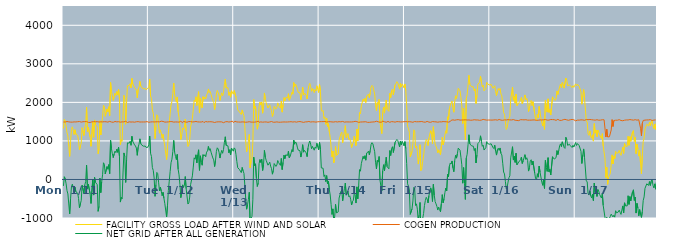
| Category | FACILITY GROSS LOAD AFTER WIND AND SOLAR | COGEN PRODUCTION | NET GRID AFTER ALL GENERATION |
|---|---|---|---|
|  Mon  1/11 | 1323 | 1490 | -167 |
|  Mon  1/11 | 1555 | 1485 | 70 |
|  Mon  1/11 | 1502 | 1491 | 11 |
|  Mon  1/11 | 1378 | 1491 | -113 |
|  Mon  1/11 | 1214 | 1503 | -289 |
|  Mon  1/11 | 1129 | 1505 | -376 |
|  Mon  1/11 | 858 | 1494 | -636 |
|  Mon  1/11 | 599 | 1493 | -894 |
|  Mon  1/11 | 986 | 1488 | -502 |
|  Mon  1/11 | 1296 | 1488 | -192 |
|  Mon  1/11 | 1365 | 1487 | -122 |
|  Mon  1/11 | 1280 | 1495 | -215 |
|  Mon  1/11 | 1166 | 1493 | -327 |
|  Mon  1/11 | 1289 | 1493 | -204 |
|  Mon  1/11 | 1171 | 1492 | -321 |
|  Mon  1/11 | 1183 | 1498 | -315 |
|  Mon  1/11 | 1144 | 1498 | -354 |
|  Mon  1/11 | 992 | 1485 | -493 |
|  Mon  1/11 | 767 | 1503 | -736 |
|  Mon  1/11 | 863 | 1501 | -638 |
|  Mon  1/11 | 942 | 1488 | -546 |
|  Mon  1/11 | 1341 | 1489 | -148 |
|  Mon  1/11 | 1361 | 1498 | -137 |
|  Mon  1/11 | 1142 | 1501 | -359 |
|  Mon  1/11 | 1358 | 1500 | -142 |
|  Mon  1/11 | 1432 | 1486 | -54 |
|  Mon  1/11 | 1874 | 1502 | 372 |
|  Mon  1/11 | 1244 | 1494 | -250 |
|  Mon  1/11 | 1355 | 1481 | -126 |
|  Mon  1/11 | 1366 | 1489 | -123 |
|  Mon  1/11 | 1105 | 1478 | -373 |
|  Mon  1/11 | 860 | 1483 | -623 |
|  Mon  1/11 | 860 | 1495 | -635 |
|  Mon  1/11 | 1492 | 1484 | 8 |
|  Mon  1/11 | 1095 | 1500 | -405 |
|  Mon  1/11 | 1544 | 1491 | 53 |
|  Mon  1/11 | 1423 | 1496 | -73 |
|  Mon  1/11 | 1428 | 1489 | -61 |
|  Mon  1/11 | 1363 | 1499 | -136 |
|  Mon  1/11 | 666 | 1493 | -827 |
|  Mon  1/11 | 793 | 1490 | -697 |
|  Mon  1/11 | 1524 | 1488 | 36 |
|  Mon  1/11 | 1153 | 1495 | -342 |
|  Mon  1/11 | 1439 | 1498 | -59 |
|  Mon  1/11 | 1615 | 1494 | 121 |
|  Mon  1/11 | 1924 | 1491 | 433 |
|  Mon  1/11 | 1892 | 1498 | 394 |
|  Mon  1/11 | 1637 | 1493 | 144 |
|  Mon  1/11 | 1657 | 1496 | 161 |
|  Mon  1/11 | 1830 | 1495 | 335 |
|  Mon  1/11 | 1753 | 1488 | 265 |
|  Mon  1/11 | 1887 | 1502 | 385 |
|  Mon  1/11 | 1657 | 1506 | 151 |
|  Mon  1/11 | 2514 | 1500 | 1014 |
|  Mon  1/11 | 2287 | 1490 | 797 |
|  Mon  1/11 | 2169 | 1502 | 667 |
|  Mon  1/11 | 2050 | 1483 | 567 |
|  Mon  1/11 | 2150 | 1488 | 662 |
|  Mon  1/11 | 2239 | 1504 | 735 |
|  Mon  1/11 | 2179 | 1484 | 695 |
|  Mon  1/11 | 2280 | 1494 | 786 |
|  Mon  1/11 | 2200 | 1496 | 704 |
|  Mon  1/11 | 2333 | 1498 | 835 |
|  Mon  1/11 | 2101 | 1495 | 606 |
|  Mon  1/11 | 900 | 1487 | -587 |
|  Mon  1/11 | 1032 | 1495 | -463 |
|  Mon  1/11 | 990 | 1494 | -504 |
|  Mon  1/11 | 1658 | 1490 | 168 |
|  Mon  1/11 | 2182 | 1494 | 688 |
|  Mon  1/11 | 2088 | 1493 | 595 |
|  Mon  1/11 | 1432 | 1509 | -77 |
|  Mon  1/11 | 2020 | 1502 | 518 |
|  Mon  1/11 | 2428 | 1478 | 950 |
|  Mon  1/11 | 2452 | 1502 | 950 |
|  Mon  1/11 | 2437 | 1495 | 942 |
|  Mon  1/11 | 2484 | 1492 | 992 |
|  Mon  1/11 | 2375 | 1489 | 886 |
|  Mon  1/11 | 2621 | 1502 | 1119 |
|  Mon  1/11 | 2476 | 1492 | 984 |
|  Mon  1/11 | 2458 | 1492 | 966 |
|  Mon  1/11 | 2382 | 1486 | 896 |
|  Mon  1/11 | 2355 | 1486 | 869 |
|  Mon  1/11 | 2311 | 1497 | 814 |
|  Mon  1/11 | 2117 | 1491 | 626 |
|  Mon  1/11 | 2337 | 1500 | 837 |
|  Mon  1/11 | 2398 | 1482 | 916 |
|  Mon  1/11 | 2544 | 1490 | 1054 |
|  Mon  1/11 | 2425 | 1496 | 929 |
|  Mon  1/11 | 2383 | 1491 | 892 |
|  Mon  1/11 | 2363 | 1491 | 872 |
|  Mon  1/11 | 2354 | 1491 | 863 |
|  Mon  1/11 | 2358 | 1495 | 863 |
|  Mon  1/11 | 2358 | 1492 | 866 |
|  Mon  1/11 | 2323 | 1493 | 830 |
|  Mon  1/11 | 2356 | 1501 | 855 |
|  Mon  1/11 | 2338 | 1501 | 837 |
|  Tue  1/12 | 2383 | 1483 | 900 |
|  Tue  1/12 | 2604 | 1480 | 1124 |
|  Tue  1/12 | 2167 | 1491 | 676 |
|  Tue  1/12 | 2094 | 1499 | 595 |
|  Tue  1/12 | 1804 | 1495 | 309 |
|  Tue  1/12 | 1720 | 1485 | 235 |
|  Tue  1/12 | 1528 | 1492 | 36 |
|  Tue  1/12 | 1059 | 1496 | -437 |
|  Tue  1/12 | 1361 | 1495 | -134 |
|  Tue  1/12 | 1678 | 1495 | 183 |
|  Tue  1/12 | 1649 | 1497 | 152 |
|  Tue  1/12 | 1418 | 1488 | -70 |
|  Tue  1/12 | 1200 | 1494 | -294 |
|  Tue  1/12 | 1287 | 1488 | -201 |
|  Tue  1/12 | 1207 | 1512 | -305 |
|  Tue  1/12 | 1070 | 1491 | -421 |
|  Tue  1/12 | 1170 | 1505 | -335 |
|  Tue  1/12 | 1003 | 1493 | -490 |
|  Tue  1/12 | 860 | 1488 | -628 |
|  Tue  1/12 | 874 | 1503 | -629 |
|  Tue  1/12 | 516 | 1490 | -974 |
|  Tue  1/12 | 811 | 1497 | -686 |
|  Tue  1/12 | 1210 | 1493 | -283 |
|  Tue  1/12 | 1468 | 1511 | -43 |
|  Tue  1/12 | 1708 | 1501 | 207 |
|  Tue  1/12 | 1932 | 1498 | 434 |
|  Tue  1/12 | 2025 | 1500 | 525 |
|  Tue  1/12 | 2222 | 1498 | 724 |
|  Tue  1/12 | 2500 | 1488 | 1012 |
|  Tue  1/12 | 2206 | 1494 | 712 |
|  Tue  1/12 | 2090 | 1492 | 598 |
|  Tue  1/12 | 2004 | 1489 | 515 |
|  Tue  1/12 | 2140 | 1491 | 649 |
|  Tue  1/12 | 1756 | 1494 | 262 |
|  Tue  1/12 | 1606 | 1487 | 119 |
|  Tue  1/12 | 1376 | 1509 | -133 |
|  Tue  1/12 | 1036 | 1509 | -473 |
|  Tue  1/12 | 1148 | 1486 | -338 |
|  Tue  1/12 | 1332 | 1472 | -140 |
|  Tue  1/12 | 1302 | 1509 | -207 |
|  Tue  1/12 | 1358 | 1504 | -146 |
|  Tue  1/12 | 1566 | 1491 | 75 |
|  Tue  1/12 | 1244 | 1483 | -239 |
|  Tue  1/12 | 1249 | 1485 | -236 |
|  Tue  1/12 | 854 | 1492 | -638 |
|  Tue  1/12 | 893 | 1502 | -609 |
|  Tue  1/12 | 1044 | 1500 | -456 |
|  Tue  1/12 | 1365 | 1500 | -135 |
|  Tue  1/12 | 1376 | 1508 | -132 |
|  Tue  1/12 | 1585 | 1492 | 93 |
|  Tue  1/12 | 1810 | 1489 | 321 |
|  Tue  1/12 | 2057 | 1496 | 561 |
|  Tue  1/12 | 2016 | 1491 | 525 |
|  Tue  1/12 | 2144 | 1504 | 640 |
|  Tue  1/12 | 1920 | 1491 | 429 |
|  Tue  1/12 | 2133 | 1493 | 640 |
|  Tue  1/12 | 2278 | 1508 | 770 |
|  Tue  1/12 | 1727 | 1491 | 236 |
|  Tue  1/12 | 2113 | 1500 | 613 |
|  Tue  1/12 | 1937 | 1490 | 447 |
|  Tue  1/12 | 1853 | 1484 | 369 |
|  Tue  1/12 | 2147 | 1503 | 644 |
|  Tue  1/12 | 2084 | 1476 | 608 |
|  Tue  1/12 | 2138 | 1496 | 642 |
|  Tue  1/12 | 2091 | 1502 | 589 |
|  Tue  1/12 | 2199 | 1491 | 708 |
|  Tue  1/12 | 2234 | 1493 | 741 |
|  Tue  1/12 | 2348 | 1491 | 857 |
|  Tue  1/12 | 2254 | 1497 | 757 |
|  Tue  1/12 | 2281 | 1482 | 799 |
|  Tue  1/12 | 2204 | 1497 | 707 |
|  Tue  1/12 | 2119 | 1487 | 632 |
|  Tue  1/12 | 2049 | 1491 | 558 |
|  Tue  1/12 | 1995 | 1486 | 509 |
|  Tue  1/12 | 1813 | 1478 | 335 |
|  Tue  1/12 | 1987 | 1490 | 497 |
|  Tue  1/12 | 2219 | 1491 | 728 |
|  Tue  1/12 | 2310 | 1489 | 821 |
|  Tue  1/12 | 2285 | 1495 | 790 |
|  Tue  1/12 | 2187 | 1483 | 704 |
|  Tue  1/12 | 2050 | 1495 | 555 |
|  Tue  1/12 | 2174 | 1500 | 674 |
|  Tue  1/12 | 2248 | 1493 | 755 |
|  Tue  1/12 | 2172 | 1493 | 679 |
|  Tue  1/12 | 2247 | 1473 | 774 |
|  Tue  1/12 | 2464 | 1498 | 966 |
|  Tue  1/12 | 2602 | 1495 | 1107 |
|  Tue  1/12 | 2373 | 1490 | 883 |
|  Tue  1/12 | 2388 | 1500 | 888 |
|  Tue  1/12 | 2379 | 1508 | 871 |
|  Tue  1/12 | 2182 | 1490 | 692 |
|  Tue  1/12 | 2263 | 1492 | 771 |
|  Tue  1/12 | 2135 | 1497 | 638 |
|  Tue  1/12 | 2304 | 1489 | 815 |
|  Tue  1/12 | 2304 | 1513 | 791 |
|  Tue  1/12 | 2211 | 1478 | 733 |
|  Wed  1/13 | 2305 | 1485 | 820 |
|  Wed  1/13 | 2299 | 1507 | 792 |
|  Wed  1/13 | 2136 | 1484 | 652 |
|  Wed  1/13 | 1958 | 1492 | 466 |
|  Wed  1/13 | 1805 | 1501 | 304 |
|  Wed  1/13 | 1805 | 1490 | 315 |
|  Wed  1/13 | 1749 | 1493 | 256 |
|  Wed  1/13 | 1739 | 1488 | 251 |
|  Wed  1/13 | 1684 | 1507 | 177 |
|  Wed  1/13 | 1804 | 1493 | 311 |
|  Wed  1/13 | 1717 | 1495 | 222 |
|  Wed  1/13 | 1650 | 1491 | 159 |
|  Wed  1/13 | 1344 | 1499 | -155 |
|  Wed  1/13 | 972 | 1484 | -512 |
|  Wed  1/13 | 718 | 1490 | -772 |
|  Wed  1/13 | 830 | 1489 | -659 |
|  Wed  1/13 | 977 | 1498 | -521 |
|  Wed  1/13 | 1165 | 1498 | -333 |
|  Wed  1/13 | 300 | 1495 | -1195 |
|  Wed  1/13 | 479 | 1488 | -1009 |
|  Wed  1/13 | 532 | 1488 | -956 |
|  Wed  1/13 | 961 | 1487 | -526 |
|  Wed  1/13 | 2073 | 1494 | 579 |
|  Wed  1/13 | 1845 | 1487 | 358 |
|  Wed  1/13 | 1896 | 1489 | 407 |
|  Wed  1/13 | 1522 | 1495 | 27 |
|  Wed  1/13 | 1304 | 1486 | -182 |
|  Wed  1/13 | 1417 | 1512 | -95 |
|  Wed  1/13 | 1892 | 1484 | 408 |
|  Wed  1/13 | 2008 | 1492 | 516 |
|  Wed  1/13 | 1932 | 1493 | 439 |
|  Wed  1/13 | 2012 | 1486 | 526 |
|  Wed  1/13 | 1720 | 1486 | 234 |
|  Wed  1/13 | 1893 | 1503 | 390 |
|  Wed  1/13 | 2244 | 1491 | 753 |
|  Wed  1/13 | 2081 | 1500 | 581 |
|  Wed  1/13 | 1988 | 1492 | 496 |
|  Wed  1/13 | 1966 | 1485 | 481 |
|  Wed  1/13 | 1853 | 1483 | 370 |
|  Wed  1/13 | 1901 | 1497 | 404 |
|  Wed  1/13 | 1939 | 1491 | 448 |
|  Wed  1/13 | 1833 | 1487 | 346 |
|  Wed  1/13 | 1784 | 1503 | 281 |
|  Wed  1/13 | 1634 | 1497 | 137 |
|  Wed  1/13 | 1720 | 1485 | 235 |
|  Wed  1/13 | 1898 | 1485 | 413 |
|  Wed  1/13 | 1905 | 1486 | 419 |
|  Wed  1/13 | 1826 | 1488 | 338 |
|  Wed  1/13 | 1866 | 1493 | 373 |
|  Wed  1/13 | 1987 | 1496 | 491 |
|  Wed  1/13 | 1923 | 1485 | 438 |
|  Wed  1/13 | 1877 | 1478 | 399 |
|  Wed  1/13 | 1850 | 1485 | 365 |
|  Wed  1/13 | 2034 | 1489 | 545 |
|  Wed  1/13 | 1746 | 1489 | 257 |
|  Wed  1/13 | 1935 | 1492 | 443 |
|  Wed  1/13 | 2122 | 1492 | 630 |
|  Wed  1/13 | 2039 | 1500 | 539 |
|  Wed  1/13 | 2127 | 1490 | 637 |
|  Wed  1/13 | 2138 | 1489 | 649 |
|  Wed  1/13 | 2114 | 1491 | 623 |
|  Wed  1/13 | 2225 | 1493 | 732 |
|  Wed  1/13 | 2054 | 1495 | 559 |
|  Wed  1/13 | 2102 | 1503 | 599 |
|  Wed  1/13 | 2078 | 1498 | 580 |
|  Wed  1/13 | 2265 | 1489 | 776 |
|  Wed  1/13 | 2211 | 1490 | 721 |
|  Wed  1/13 | 2512 | 1495 | 1017 |
|  Wed  1/13 | 2411 | 1497 | 914 |
|  Wed  1/13 | 2472 | 1499 | 973 |
|  Wed  1/13 | 2428 | 1487 | 941 |
|  Wed  1/13 | 2345 | 1506 | 839 |
|  Wed  1/13 | 2260 | 1498 | 762 |
|  Wed  1/13 | 2246 | 1494 | 752 |
|  Wed  1/13 | 2246 | 1502 | 744 |
|  Wed  1/13 | 2070 | 1489 | 581 |
|  Wed  1/13 | 2192 | 1492 | 700 |
|  Wed  1/13 | 2398 | 1496 | 902 |
|  Wed  1/13 | 2189 | 1481 | 708 |
|  Wed  1/13 | 2241 | 1486 | 755 |
|  Wed  1/13 | 2223 | 1493 | 730 |
|  Wed  1/13 | 2178 | 1489 | 689 |
|  Wed  1/13 | 2087 | 1495 | 592 |
|  Wed  1/13 | 2310 | 1496 | 814 |
|  Wed  1/13 | 2434 | 1504 | 930 |
|  Wed  1/13 | 2494 | 1497 | 997 |
|  Wed  1/13 | 2407 | 1490 | 917 |
|  Wed  1/13 | 2288 | 1491 | 797 |
|  Wed  1/13 | 2355 | 1496 | 859 |
|  Wed  1/13 | 2329 | 1488 | 841 |
|  Wed  1/13 | 2253 | 1494 | 759 |
|  Wed  1/13 | 2337 | 1498 | 839 |
|  Wed  1/13 | 2296 | 1488 | 808 |
|  Wed  1/13 | 2430 | 1492 | 938 |
|  Wed  1/13 | 2344 | 1496 | 848 |
|  Wed  1/13 | 2256 | 1488 | 768 |
|  Thu  1/14 | 2459 | 1499 | 960 |
|  Thu  1/14 | 2288 | 1500 | 788 |
|  Thu  1/14 | 1799 | 1500 | 299 |
|  Thu  1/14 | 1765 | 1485 | 280 |
|  Thu  1/14 | 1792 | 1501 | 291 |
|  Thu  1/14 | 1581 | 1504 | 77 |
|  Thu  1/14 | 1623 | 1504 | 119 |
|  Thu  1/14 | 1431 | 1486 | -55 |
|  Thu  1/14 | 1588 | 1489 | 99 |
|  Thu  1/14 | 1376 | 1492 | -116 |
|  Thu  1/14 | 1449 | 1498 | -49 |
|  Thu  1/14 | 1238 | 1504 | -266 |
|  Thu  1/14 | 1094 | 1498 | -404 |
|  Thu  1/14 | 832 | 1481 | -649 |
|  Thu  1/14 | 585 | 1492 | -907 |
|  Thu  1/14 | 735 | 1498 | -763 |
|  Thu  1/14 | 432 | 1490 | -1058 |
|  Thu  1/14 | 515 | 1492 | -977 |
|  Thu  1/14 | 854 | 1499 | -645 |
|  Thu  1/14 | 624 | 1491 | -867 |
|  Thu  1/14 | 613 | 1491 | -878 |
|  Thu  1/14 | 659 | 1501 | -842 |
|  Thu  1/14 | 1017 | 1499 | -482 |
|  Thu  1/14 | 1104 | 1502 | -398 |
|  Thu  1/14 | 1188 | 1495 | -307 |
|  Thu  1/14 | 1228 | 1504 | -276 |
|  Thu  1/14 | 951 | 1505 | -554 |
|  Thu  1/14 | 1123 | 1495 | -372 |
|  Thu  1/14 | 1246 | 1487 | -241 |
|  Thu  1/14 | 1396 | 1490 | -94 |
|  Thu  1/14 | 1086 | 1493 | -407 |
|  Thu  1/14 | 1140 | 1486 | -346 |
|  Thu  1/14 | 1192 | 1492 | -300 |
|  Thu  1/14 | 1035 | 1486 | -451 |
|  Thu  1/14 | 1068 | 1492 | -424 |
|  Thu  1/14 | 976 | 1490 | -514 |
|  Thu  1/14 | 829 | 1492 | -663 |
|  Thu  1/14 | 919 | 1490 | -571 |
|  Thu  1/14 | 957 | 1497 | -540 |
|  Thu  1/14 | 1127 | 1490 | -363 |
|  Thu  1/14 | 1112 | 1508 | -396 |
|  Thu  1/14 | 880 | 1492 | -612 |
|  Thu  1/14 | 1308 | 1500 | -192 |
|  Thu  1/14 | 997 | 1500 | -503 |
|  Thu  1/14 | 1325 | 1482 | -157 |
|  Thu  1/14 | 1740 | 1484 | 256 |
|  Thu  1/14 | 1703 | 1490 | 213 |
|  Thu  1/14 | 1909 | 1499 | 410 |
|  Thu  1/14 | 1918 | 1492 | 426 |
|  Thu  1/14 | 2087 | 1484 | 603 |
|  Thu  1/14 | 2025 | 1494 | 531 |
|  Thu  1/14 | 2103 | 1487 | 616 |
|  Thu  1/14 | 1997 | 1497 | 500 |
|  Thu  1/14 | 2164 | 1483 | 681 |
|  Thu  1/14 | 2182 | 1482 | 700 |
|  Thu  1/14 | 2213 | 1480 | 733 |
|  Thu  1/14 | 2121 | 1482 | 639 |
|  Thu  1/14 | 2251 | 1497 | 754 |
|  Thu  1/14 | 2399 | 1488 | 911 |
|  Thu  1/14 | 2440 | 1486 | 954 |
|  Thu  1/14 | 2413 | 1491 | 922 |
|  Thu  1/14 | 2405 | 1498 | 907 |
|  Thu  1/14 | 2216 | 1495 | 721 |
|  Thu  1/14 | 1933 | 1485 | 448 |
|  Thu  1/14 | 1783 | 1510 | 273 |
|  Thu  1/14 | 1997 | 1500 | 497 |
|  Thu  1/14 | 1946 | 1495 | 451 |
|  Thu  1/14 | 2074 | 1479 | 595 |
|  Thu  1/14 | 1466 | 1485 | -19 |
|  Thu  1/14 | 1326 | 1500 | -174 |
|  Thu  1/14 | 1190 | 1487 | -297 |
|  Thu  1/14 | 1737 | 1515 | 222 |
|  Thu  1/14 | 1874 | 1492 | 382 |
|  Thu  1/14 | 1721 | 1497 | 224 |
|  Thu  1/14 | 1905 | 1489 | 416 |
|  Thu  1/14 | 2061 | 1484 | 577 |
|  Thu  1/14 | 1818 | 1486 | 332 |
|  Thu  1/14 | 1828 | 1505 | 323 |
|  Thu  1/14 | 1767 | 1491 | 276 |
|  Thu  1/14 | 2232 | 1483 | 749 |
|  Thu  1/14 | 2124 | 1502 | 622 |
|  Thu  1/14 | 2296 | 1500 | 796 |
|  Thu  1/14 | 2341 | 1491 | 850 |
|  Thu  1/14 | 2195 | 1496 | 699 |
|  Thu  1/14 | 2180 | 1505 | 675 |
|  Thu  1/14 | 2453 | 1487 | 966 |
|  Thu  1/14 | 2488 | 1486 | 1002 |
|  Thu  1/14 | 2538 | 1501 | 1037 |
|  Thu  1/14 | 2507 | 1499 | 1008 |
|  Thu  1/14 | 2515 | 1498 | 1017 |
|  Thu  1/14 | 2344 | 1500 | 844 |
|  Thu  1/14 | 2487 | 1492 | 995 |
|  Thu  1/14 | 2399 | 1501 | 898 |
|  Thu  1/14 | 2479 | 1494 | 985 |
|  Thu  1/14 | 2443 | 1492 | 951 |
|  Thu  1/14 | 2371 | 1498 | 873 |
|  Fri  1/15 | 2477 | 1497 | 980 |
|  Fri  1/15 | 2303 | 1502 | 801 |
|  Fri  1/15 | 1917 | 1505 | 412 |
|  Fri  1/15 | 1382 | 1495 | -113 |
|  Fri  1/15 | 1317 | 1491 | -174 |
|  Fri  1/15 | 1227 | 1499 | -272 |
|  Fri  1/15 | 586 | 1492 | -906 |
|  Fri  1/15 | 611 | 1493 | -882 |
|  Fri  1/15 | 728 | 1490 | -762 |
|  Fri  1/15 | 926 | 1484 | -558 |
|  Fri  1/15 | 1288 | 1494 | -206 |
|  Fri  1/15 | 1259 | 1503 | -244 |
|  Fri  1/15 | 822 | 1498 | -676 |
|  Fri  1/15 | 864 | 1496 | -632 |
|  Fri  1/15 | 731 | 1501 | -770 |
|  Fri  1/15 | 399 | 1497 | -1098 |
|  Fri  1/15 | 566 | 1492 | -926 |
|  Fri  1/15 | 902 | 1499 | -597 |
|  Fri  1/15 | 233 | 1488 | -1255 |
|  Fri  1/15 | 287 | 1503 | -1216 |
|  Fri  1/15 | 473 | 1487 | -1014 |
|  Fri  1/15 | 608 | 1490 | -882 |
|  Fri  1/15 | 830 | 1506 | -676 |
|  Fri  1/15 | 938 | 1486 | -548 |
|  Fri  1/15 | 1038 | 1502 | -464 |
|  Fri  1/15 | 999 | 1506 | -507 |
|  Fri  1/15 | 879 | 1488 | -609 |
|  Fri  1/15 | 1067 | 1488 | -421 |
|  Fri  1/15 | 1182 | 1492 | -310 |
|  Fri  1/15 | 1265 | 1483 | -218 |
|  Fri  1/15 | 1169 | 1488 | -319 |
|  Fri  1/15 | 930 | 1502 | -572 |
|  Fri  1/15 | 1369 | 1496 | -127 |
|  Fri  1/15 | 1092 | 1497 | -405 |
|  Fri  1/15 | 916 | 1491 | -575 |
|  Fri  1/15 | 861 | 1494 | -633 |
|  Fri  1/15 | 792 | 1493 | -701 |
|  Fri  1/15 | 692 | 1486 | -794 |
|  Fri  1/15 | 769 | 1486 | -717 |
|  Fri  1/15 | 712 | 1495 | -783 |
|  Fri  1/15 | 639 | 1478 | -839 |
|  Fri  1/15 | 870 | 1493 | -623 |
|  Fri  1/15 | 1092 | 1486 | -394 |
|  Fri  1/15 | 896 | 1502 | -606 |
|  Fri  1/15 | 988 | 1489 | -501 |
|  Fri  1/15 | 1159 | 1498 | -339 |
|  Fri  1/15 | 1266 | 1489 | -223 |
|  Fri  1/15 | 1198 | 1496 | -298 |
|  Fri  1/15 | 1625 | 1494 | 131 |
|  Fri  1/15 | 1557 | 1487 | 70 |
|  Fri  1/15 | 1830 | 1488 | 342 |
|  Fri  1/15 | 1930 | 1502 | 428 |
|  Fri  1/15 | 1937 | 1535 | 402 |
|  Fri  1/15 | 2037 | 1557 | 480 |
|  Fri  1/15 | 1846 | 1546 | 300 |
|  Fri  1/15 | 1744 | 1543 | 201 |
|  Fri  1/15 | 2024 | 1536 | 488 |
|  Fri  1/15 | 2170 | 1546 | 624 |
|  Fri  1/15 | 2100 | 1547 | 553 |
|  Fri  1/15 | 2209 | 1544 | 665 |
|  Fri  1/15 | 2364 | 1552 | 812 |
|  Fri  1/15 | 2373 | 1548 | 825 |
|  Fri  1/15 | 2298 | 1540 | 758 |
|  Fri  1/15 | 2131 | 1554 | 577 |
|  Fri  1/15 | 1923 | 1542 | 381 |
|  Fri  1/15 | 1452 | 1549 | -97 |
|  Fri  1/15 | 1852 | 1544 | 308 |
|  Fri  1/15 | 1430 | 1534 | -104 |
|  Fri  1/15 | 1029 | 1547 | -518 |
|  Fri  1/15 | 2100 | 1546 | 554 |
|  Fri  1/15 | 2196 | 1542 | 654 |
|  Fri  1/15 | 2437 | 1537 | 900 |
|  Fri  1/15 | 2702 | 1543 | 1159 |
|  Fri  1/15 | 2468 | 1546 | 922 |
|  Fri  1/15 | 2464 | 1536 | 928 |
|  Fri  1/15 | 2403 | 1532 | 871 |
|  Fri  1/15 | 2408 | 1540 | 868 |
|  Fri  1/15 | 2404 | 1543 | 861 |
|  Fri  1/15 | 2298 | 1549 | 749 |
|  Fri  1/15 | 2349 | 1543 | 806 |
|  Fri  1/15 | 1971 | 1543 | 428 |
|  Fri  1/15 | 2179 | 1544 | 635 |
|  Fri  1/15 | 2471 | 1543 | 928 |
|  Fri  1/15 | 2491 | 1534 | 957 |
|  Fri  1/15 | 2523 | 1534 | 989 |
|  Fri  1/15 | 2678 | 1546 | 1132 |
|  Fri  1/15 | 2535 | 1540 | 995 |
|  Fri  1/15 | 2398 | 1538 | 860 |
|  Fri  1/15 | 2447 | 1558 | 889 |
|  Fri  1/15 | 2298 | 1535 | 763 |
|  Fri  1/15 | 2303 | 1548 | 755 |
|  Fri  1/15 | 2361 | 1535 | 826 |
|  Fri  1/15 | 2520 | 1540 | 980 |
|  Fri  1/15 | 2478 | 1547 | 931 |
|  Fri  1/15 | 2462 | 1542 | 920 |
|  Fri  1/15 | 2452 | 1538 | 914 |
|  Sat  1/16 | 2457 | 1541 | 916 |
|  Sat  1/16 | 2465 | 1541 | 924 |
|  Sat  1/16 | 2480 | 1540 | 940 |
|  Sat  1/16 | 2366 | 1537 | 829 |
|  Sat  1/16 | 2346 | 1544 | 802 |
|  Sat  1/16 | 2432 | 1543 | 889 |
|  Sat  1/16 | 2282 | 1548 | 734 |
|  Sat  1/16 | 2177 | 1545 | 632 |
|  Sat  1/16 | 2302 | 1538 | 764 |
|  Sat  1/16 | 2359 | 1549 | 810 |
|  Sat  1/16 | 2309 | 1556 | 753 |
|  Sat  1/16 | 2365 | 1548 | 817 |
|  Sat  1/16 | 2216 | 1540 | 676 |
|  Sat  1/16 | 2168 | 1532 | 636 |
|  Sat  1/16 | 1955 | 1535 | 420 |
|  Sat  1/16 | 1736 | 1543 | 193 |
|  Sat  1/16 | 1689 | 1546 | 143 |
|  Sat  1/16 | 1494 | 1544 | -50 |
|  Sat  1/16 | 1297 | 1544 | -247 |
|  Sat  1/16 | 1345 | 1548 | -203 |
|  Sat  1/16 | 1485 | 1552 | -67 |
|  Sat  1/16 | 1584 | 1538 | 46 |
|  Sat  1/16 | 1639 | 1545 | 94 |
|  Sat  1/16 | 2087 | 1527 | 560 |
|  Sat  1/16 | 2107 | 1544 | 563 |
|  Sat  1/16 | 2396 | 1547 | 849 |
|  Sat  1/16 | 2056 | 1553 | 503 |
|  Sat  1/16 | 2152 | 1548 | 604 |
|  Sat  1/16 | 1978 | 1536 | 442 |
|  Sat  1/16 | 2214 | 1534 | 680 |
|  Sat  1/16 | 1910 | 1532 | 378 |
|  Sat  1/16 | 1925 | 1551 | 374 |
|  Sat  1/16 | 1979 | 1526 | 453 |
|  Sat  1/16 | 2019 | 1538 | 481 |
|  Sat  1/16 | 2064 | 1550 | 514 |
|  Sat  1/16 | 2126 | 1545 | 581 |
|  Sat  1/16 | 1964 | 1549 | 415 |
|  Sat  1/16 | 2035 | 1548 | 487 |
|  Sat  1/16 | 2047 | 1546 | 501 |
|  Sat  1/16 | 2193 | 1550 | 643 |
|  Sat  1/16 | 2071 | 1550 | 521 |
|  Sat  1/16 | 2103 | 1539 | 564 |
|  Sat  1/16 | 2035 | 1539 | 496 |
|  Sat  1/16 | 1762 | 1545 | 217 |
|  Sat  1/16 | 1839 | 1539 | 300 |
|  Sat  1/16 | 2017 | 1532 | 485 |
|  Sat  1/16 | 2051 | 1539 | 512 |
|  Sat  1/16 | 1915 | 1541 | 374 |
|  Sat  1/16 | 2018 | 1544 | 474 |
|  Sat  1/16 | 1995 | 1537 | 458 |
|  Sat  1/16 | 1705 | 1543 | 162 |
|  Sat  1/16 | 1563 | 1545 | 18 |
|  Sat  1/16 | 1525 | 1534 | -9 |
|  Sat  1/16 | 1686 | 1537 | 149 |
|  Sat  1/16 | 1596 | 1536 | 60 |
|  Sat  1/16 | 1894 | 1548 | 346 |
|  Sat  1/16 | 1729 | 1544 | 185 |
|  Sat  1/16 | 1750 | 1542 | 208 |
|  Sat  1/16 | 1470 | 1543 | -73 |
|  Sat  1/16 | 1386 | 1538 | -152 |
|  Sat  1/16 | 1547 | 1548 | -1 |
|  Sat  1/16 | 1301 | 1534 | -233 |
|  Sat  1/16 | 2050 | 1556 | 494 |
|  Sat  1/16 | 1866 | 1550 | 316 |
|  Sat  1/16 | 1747 | 1539 | 208 |
|  Sat  1/16 | 2092 | 1527 | 565 |
|  Sat  1/16 | 1740 | 1540 | 200 |
|  Sat  1/16 | 1814 | 1551 | 263 |
|  Sat  1/16 | 1671 | 1555 | 116 |
|  Sat  1/16 | 1659 | 1535 | 124 |
|  Sat  1/16 | 2143 | 1553 | 590 |
|  Sat  1/16 | 2104 | 1548 | 556 |
|  Sat  1/16 | 2079 | 1550 | 529 |
|  Sat  1/16 | 2050 | 1542 | 508 |
|  Sat  1/16 | 2100 | 1533 | 567 |
|  Sat  1/16 | 2296 | 1547 | 749 |
|  Sat  1/16 | 2205 | 1560 | 645 |
|  Sat  1/16 | 2306 | 1554 | 752 |
|  Sat  1/16 | 2405 | 1533 | 872 |
|  Sat  1/16 | 2475 | 1552 | 923 |
|  Sat  1/16 | 2384 | 1532 | 852 |
|  Sat  1/16 | 2516 | 1539 | 977 |
|  Sat  1/16 | 2468 | 1549 | 919 |
|  Sat  1/16 | 2370 | 1538 | 832 |
|  Sat  1/16 | 2366 | 1560 | 806 |
|  Sat  1/16 | 2632 | 1539 | 1093 |
|  Sat  1/16 | 2576 | 1546 | 1030 |
|  Sat  1/16 | 2430 | 1545 | 885 |
|  Sat  1/16 | 2406 | 1535 | 871 |
|  Sat  1/16 | 2453 | 1541 | 912 |
|  Sat  1/16 | 2426 | 1549 | 877 |
|  Sat  1/16 | 2439 | 1542 | 897 |
|  Sat  1/16 | 2386 | 1557 | 829 |
|  Sat  1/16 | 2434 | 1547 | 887 |
|  Sat  1/16 | 2389 | 1548 | 841 |
|  Sat  1/16 | 2385 | 1533 | 852 |
|  Sun  1/17 | 2479 | 1520 | 959 |
|  Sun  1/17 | 2427 | 1545 | 882 |
|  Sun  1/17 | 2469 | 1539 | 930 |
|  Sun  1/17 | 2457 | 1536 | 921 |
|  Sun  1/17 | 2418 | 1540 | 878 |
|  Sun  1/17 | 2420 | 1538 | 882 |
|  Sun  1/17 | 2275 | 1546 | 729 |
|  Sun  1/17 | 1952 | 1538 | 414 |
|  Sun  1/17 | 2175 | 1544 | 631 |
|  Sun  1/17 | 2333 | 1541 | 792 |
|  Sun  1/17 | 2105 | 1535 | 570 |
|  Sun  1/17 | 2130 | 1535 | 595 |
|  Sun  1/17 | 1516 | 1553 | -37 |
|  Sun  1/17 | 1490 | 1554 | -64 |
|  Sun  1/17 | 1183 | 1551 | -368 |
|  Sun  1/17 | 1143 | 1548 | -405 |
|  Sun  1/17 | 1260 | 1556 | -296 |
|  Sun  1/17 | 1119 | 1543 | -424 |
|  Sun  1/17 | 1070 | 1550 | -480 |
|  Sun  1/17 | 1158 | 1544 | -386 |
|  Sun  1/17 | 995 | 1544 | -549 |
|  Sun  1/17 | 1449 | 1542 | -93 |
|  Sun  1/17 | 1200 | 1538 | -338 |
|  Sun  1/17 | 1283 | 1538 | -255 |
|  Sun  1/17 | 1110 | 1549 | -439 |
|  Sun  1/17 | 1282 | 1543 | -261 |
|  Sun  1/17 | 1231 | 1537 | -306 |
|  Sun  1/17 | 1158 | 1549 | -391 |
|  Sun  1/17 | 1173 | 1540 | -367 |
|  Sun  1/17 | 1063 | 1545 | -482 |
|  Sun  1/17 | 1190 | 1549 | -359 |
|  Sun  1/17 | 868 | 1542 | -674 |
|  Sun  1/17 | 883 | 1548 | -665 |
|  Sun  1/17 | 552 | 1536 | -984 |
|  Sun  1/17 | 51 | 1101 | -1050 |
|  Sun  1/17 | 316 | 1301 | -985 |
|  Sun  1/17 | -126 | 1102 | -1228 |
|  Sun  1/17 | 50 | 1101 | -1051 |
|  Sun  1/17 | 50 | 1109 | -1059 |
|  Sun  1/17 | 160 | 1120 | -960 |
|  Sun  1/17 | 383 | 1283 | -900 |
|  Sun  1/17 | 637 | 1552 | -915 |
|  Sun  1/17 | 402 | 1375 | -973 |
|  Sun  1/17 | 601 | 1529 | -928 |
|  Sun  1/17 | 541 | 1519 | -978 |
|  Sun  1/17 | 726 | 1537 | -811 |
|  Sun  1/17 | 679 | 1546 | -867 |
|  Sun  1/17 | 673 | 1537 | -864 |
|  Sun  1/17 | 690 | 1533 | -843 |
|  Sun  1/17 | 755 | 1551 | -796 |
|  Sun  1/17 | 682 | 1534 | -852 |
|  Sun  1/17 | 624 | 1530 | -906 |
|  Sun  1/17 | 632 | 1551 | -919 |
|  Sun  1/17 | 836 | 1523 | -687 |
|  Sun  1/17 | 676 | 1542 | -866 |
|  Sun  1/17 | 931 | 1537 | -606 |
|  Sun  1/17 | 864 | 1548 | -684 |
|  Sun  1/17 | 865 | 1544 | -679 |
|  Sun  1/17 | 858 | 1544 | -686 |
|  Sun  1/17 | 1120 | 1543 | -423 |
|  Sun  1/17 | 886 | 1533 | -647 |
|  Sun  1/17 | 1110 | 1554 | -444 |
|  Sun  1/17 | 989 | 1545 | -556 |
|  Sun  1/17 | 987 | 1546 | -559 |
|  Sun  1/17 | 1231 | 1550 | -319 |
|  Sun  1/17 | 1271 | 1539 | -268 |
|  Sun  1/17 | 986 | 1529 | -543 |
|  Sun  1/17 | 1094 | 1551 | -457 |
|  Sun  1/17 | 670 | 1542 | -872 |
|  Sun  1/17 | 918 | 1538 | -620 |
|  Sun  1/17 | 791 | 1533 | -742 |
|  Sun  1/17 | 606 | 1549 | -943 |
|  Sun  1/17 | 753 | 1535 | -782 |
|  Sun  1/17 | 415 | 1329 | -914 |
|  Sun  1/17 | 148 | 1133 | -985 |
|  Sun  1/17 | 628 | 1458 | -830 |
|  Sun  1/17 | 985 | 1531 | -546 |
|  Sun  1/17 | 1072 | 1525 | -453 |
|  Sun  1/17 | 1309 | 1540 | -231 |
|  Sun  1/17 | 1296 | 1548 | -252 |
|  Sun  1/17 | 1431 | 1544 | -113 |
|  Sun  1/17 | 1444 | 1547 | -103 |
|  Sun  1/17 | 1390 | 1545 | -155 |
|  Sun  1/17 | 1482 | 1537 | -55 |
|  Sun  1/17 | 1397 | 1552 | -155 |
|  Sun  1/17 | 1492 | 1538 | -46 |
|  Sun  1/17 | 1533 | 1530 | 3 |
|  Sun  1/17 | 1390 | 1543 | -153 |
|  Sun  1/17 | 1320 | 1540 | -220 |
|  Sun  1/17 | 1434 | 1548 | -114 |
|  Sun  1/17 | 1293 | 1545 | -252 |
|  Sun  1/17 | 1512 | 1556 | -44 |